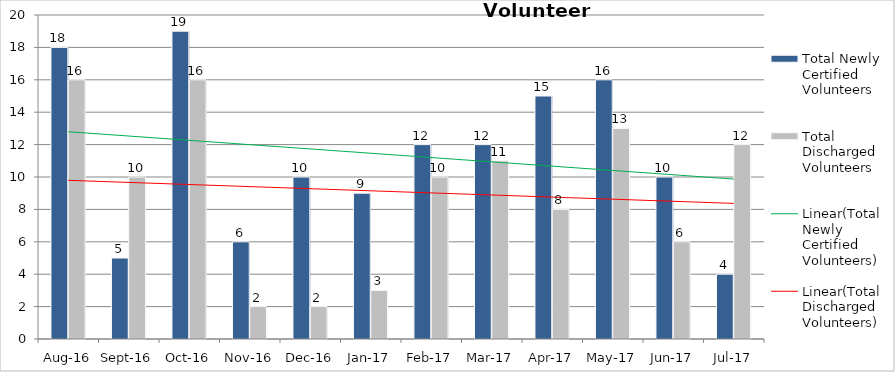
| Category | Total Newly Certified Volunteers | Total Discharged Volunteers |
|---|---|---|
| Aug-16 | 18 | 16 |
| Sep-16 | 5 | 10 |
| Oct-16 | 19 | 16 |
| Nov-16 | 6 | 2 |
| Dec-16 | 10 | 2 |
| Jan-17 | 9 | 3 |
| Feb-17 | 12 | 10 |
| Mar-17 | 12 | 11 |
| Apr-17 | 15 | 8 |
| May-17 | 16 | 13 |
| Jun-17 | 10 | 6 |
| Jul-17 | 4 | 12 |